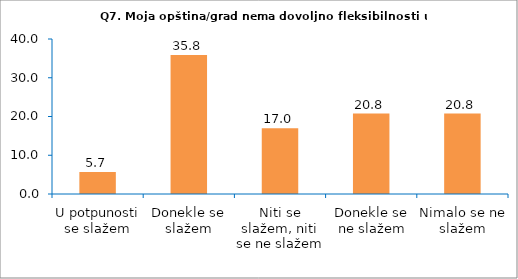
| Category | Series 0 |
|---|---|
| U potpunosti se slažem | 5.66 |
| Donekle se slažem | 35.849 |
| Niti se slažem, niti se ne slažem | 16.981 |
| Donekle se ne slažem | 20.755 |
| Nimalo se ne slažem | 20.755 |